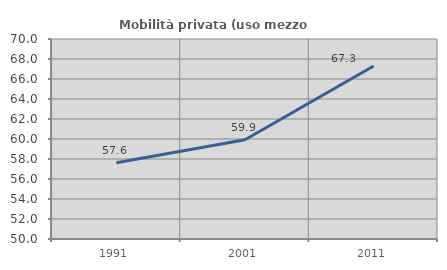
| Category | Mobilità privata (uso mezzo privato) |
|---|---|
| 1991.0 | 57.619 |
| 2001.0 | 59.919 |
| 2011.0 | 67.302 |